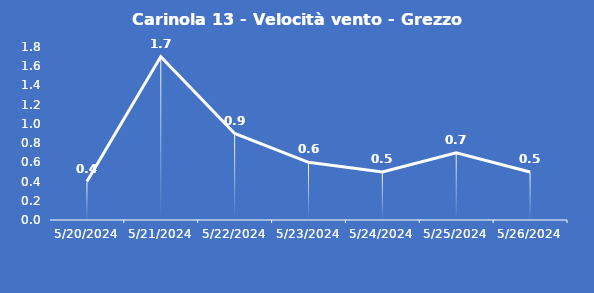
| Category | Carinola 13 - Velocità vento - Grezzo (m/s) |
|---|---|
| 5/20/24 | 0.4 |
| 5/21/24 | 1.7 |
| 5/22/24 | 0.9 |
| 5/23/24 | 0.6 |
| 5/24/24 | 0.5 |
| 5/25/24 | 0.7 |
| 5/26/24 | 0.5 |